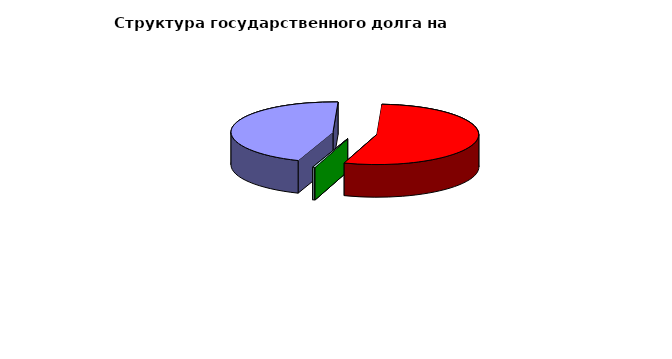
| Category | Series 0 |
|---|---|
| Договоры и соглашения о получении бюджетных кредитов от бюджетов других уровней бюджетной системы  | 31846902.963 |
| Государственные займы, осуществляемые путем выпуска ценных бумаг  | 38300000 |
| Кредитные соглашения и договоры | 0 |
| Договоры о предоставлении государственных гарантий | 253223.16 |